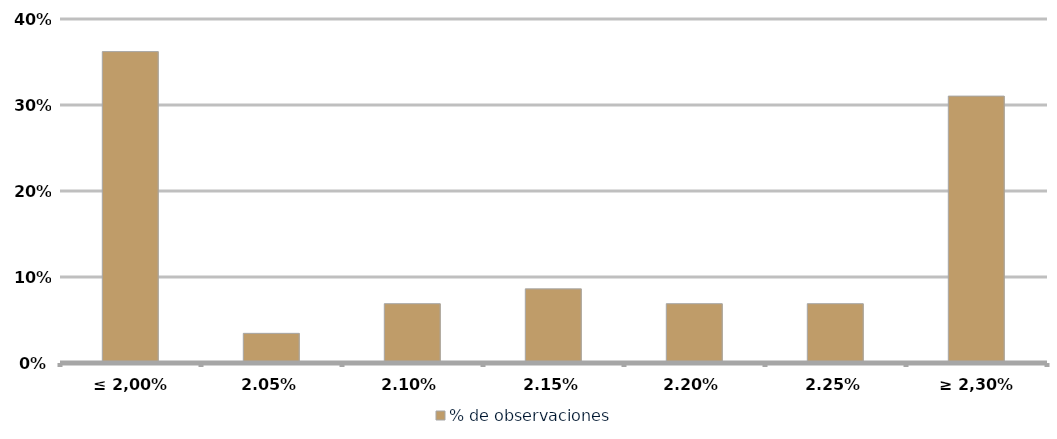
| Category | % de observaciones  |
|---|---|
| ≤ 2,00% | 0.362 |
| 2,05% | 0.034 |
| 2,10% | 0.069 |
| 2,15% | 0.086 |
| 2,20% | 0.069 |
| 2,25% | 0.069 |
| ≥ 2,30% | 0.31 |